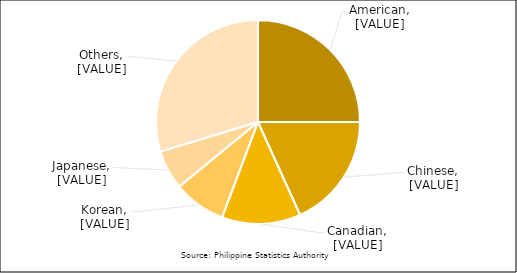
| Category | Series 0 |
|---|---|
| American | 25 |
| Chinese | 18.229 |
| Canadian | 12.5 |
| Korean | 8.333 |
| Japanese | 6.25 |
| Others | 29.688 |